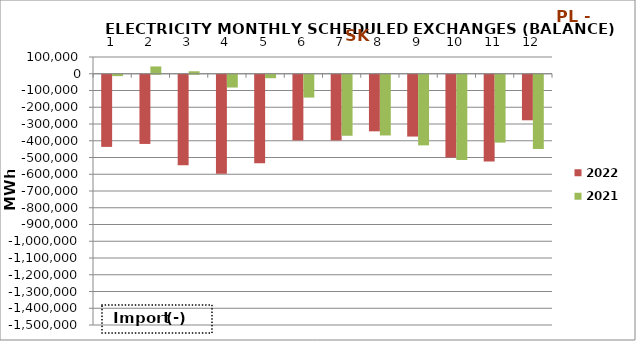
| Category | 2022 | 2021 |
|---|---|---|
| 0 | -430778.6 | -8244 |
| 1 | -413059.5 | 43608 |
| 2 | -539610.2 | 14765 |
| 3 | -590685.6 | -76243 |
| 4 | -528985.9 | -20686 |
| 5 | -392038.6 | -136261 |
| 6 | -391971.9 | -364245.6 |
| 7 | -337824.7 | -362502.7 |
| 8 | -368982.2 | -421565.4 |
| 9 | -494048.4 | -509271.7 |
| 10 | -518526.5 | -405207.7 |
| 11 | -271838.5 | -443450.9 |